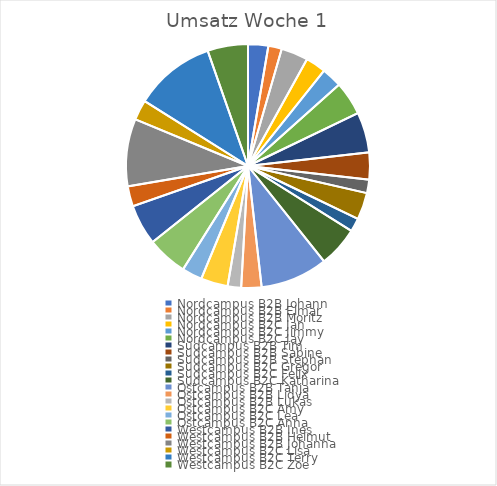
| Category | Umsatz Woche 1 |
|---|---|
| 0 | 30 |
| 1 | 20 |
| 2 | 40 |
| 3 | 30 |
| 4 | 30 |
| 5 | 50 |
| 6 | 60 |
| 7 | 40 |
| 8 | 20 |
| 9 | 40 |
| 10 | 20 |
| 11 | 60 |
| 12 | 100 |
| 13 | 30 |
| 14 | 20 |
| 15 | 40 |
| 16 | 30 |
| 17 | 60 |
| 18 | 60 |
| 19 | 30 |
| 20 | 100 |
| 21 | 30 |
| 22 | 120 |
| 23 | 60 |